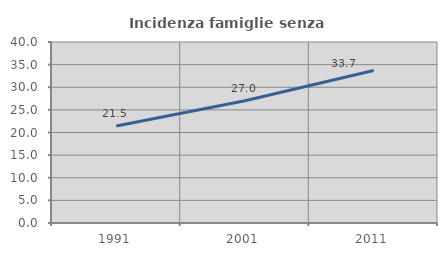
| Category | Incidenza famiglie senza nuclei |
|---|---|
| 1991.0 | 21.454 |
| 2001.0 | 27.025 |
| 2011.0 | 33.695 |